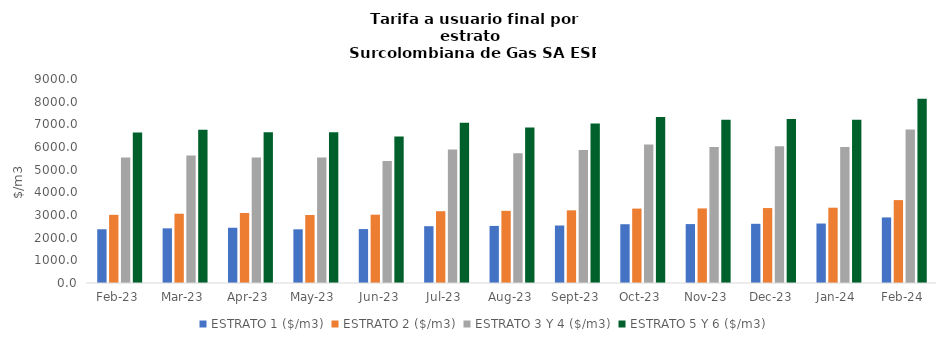
| Category | ESTRATO 1 ($/m3) | ESTRATO 2 ($/m3) | ESTRATO 3 Y 4 ($/m3) | ESTRATO 5 Y 6 ($/m3) |
|---|---|---|---|---|
| 2023-02-01 | 2371.01 | 3007.35 | 5533.45 | 6640.14 |
| 2023-03-01 | 2411.54 | 3057.29 | 5630.28 | 6756.336 |
| 2023-04-01 | 2436.88 | 3089.41 | 5539.66 | 6647.592 |
| 2023-05-01 | 2368.72 | 3000.27 | 5539.66 | 6647.592 |
| 2023-06-01 | 2379.07 | 3013.38 | 5382.53 | 6459.036 |
| 2023-07-01 | 2506.06 | 3167.43 | 5894.36 | 7073.232 |
| 2023-08-01 | 2518.61 | 3183.29 | 5720.38 | 6864.456 |
| 2023-09-01 | 2536.22 | 3205.55 | 5864.55 | 7037.46 |
| 2023-10-01 | 2592.91 | 3282.61 | 6107.41 | 7328.892 |
| 2023-11-01 | 2599.39 | 3290.81 | 6004.48 | 7205.376 |
| 2023-12-01 | 2611.58 | 3306.24 | 6032.48 | 7238.976 |
| 2024-01-01 | 2623.58 | 3321.44 | 6004.16 | 7204.992 |
| 2024-02-01 | 2892.68 | 3657.47 | 6773.09 | 8127.708 |